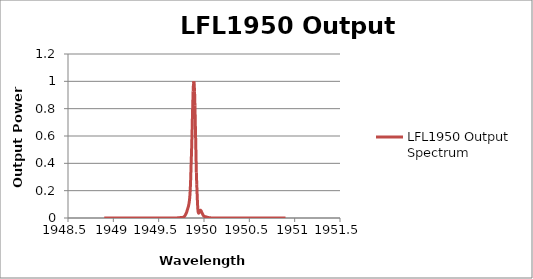
| Category | LFL1950 Output Spectrum |
|---|---|
| 1948.9 | 0 |
| 1948.904 | 0 |
| 1948.908 | 0 |
| 1948.912 | 0 |
| 1948.916 | 0 |
| 1948.92 | 0 |
| 1948.924 | 0 |
| 1948.928 | 0 |
| 1948.932 | 0 |
| 1948.936 | 0 |
| 1948.94 | 0 |
| 1948.944 | 0 |
| 1948.948 | 0 |
| 1948.952 | 0 |
| 1948.956 | 0 |
| 1948.96 | 0 |
| 1948.964 | 0 |
| 1948.968 | 0 |
| 1948.972 | 0 |
| 1948.976 | 0 |
| 1948.98 | 0 |
| 1948.984 | 0 |
| 1948.988 | 0 |
| 1948.992 | 0 |
| 1948.996 | 0 |
| 1949.0 | 0 |
| 1949.004 | 0 |
| 1949.008 | 0 |
| 1949.012 | 0 |
| 1949.016 | 0 |
| 1949.02 | 0 |
| 1949.024 | 0 |
| 1949.028 | 0 |
| 1949.032 | 0 |
| 1949.036 | 0 |
| 1949.04 | 0 |
| 1949.044 | 0 |
| 1949.048 | 0 |
| 1949.052 | 0 |
| 1949.056 | 0 |
| 1949.06 | 0 |
| 1949.064 | 0 |
| 1949.068 | 0 |
| 1949.072 | 0 |
| 1949.076 | 0 |
| 1949.08 | 0 |
| 1949.084 | 0 |
| 1949.088 | 0 |
| 1949.092 | 0 |
| 1949.096 | 0 |
| 1949.1 | 0 |
| 1949.104 | 0 |
| 1949.108 | 0 |
| 1949.112 | 0 |
| 1949.116 | 0 |
| 1949.12 | 0 |
| 1949.124 | 0 |
| 1949.128 | 0 |
| 1949.132 | 0 |
| 1949.136 | 0 |
| 1949.14 | 0 |
| 1949.144 | 0 |
| 1949.148 | 0 |
| 1949.152 | 0 |
| 1949.156 | 0 |
| 1949.16 | 0 |
| 1949.164 | 0 |
| 1949.168 | 0 |
| 1949.172 | 0 |
| 1949.176 | 0 |
| 1949.18 | 0 |
| 1949.184 | 0 |
| 1949.188 | 0 |
| 1949.192 | 0 |
| 1949.196 | 0 |
| 1949.2 | 0 |
| 1949.204 | 0 |
| 1949.208 | 0 |
| 1949.212 | 0 |
| 1949.216 | 0 |
| 1949.22 | 0 |
| 1949.224 | 0 |
| 1949.228 | 0 |
| 1949.232 | 0 |
| 1949.236 | 0 |
| 1949.24 | 0 |
| 1949.244 | 0 |
| 1949.248 | 0 |
| 1949.252 | 0 |
| 1949.256 | 0 |
| 1949.26 | 0 |
| 1949.264 | 0 |
| 1949.268 | 0 |
| 1949.272 | 0 |
| 1949.276 | 0 |
| 1949.28 | 0 |
| 1949.284 | 0 |
| 1949.288 | 0 |
| 1949.292 | 0 |
| 1949.296 | 0 |
| 1949.3 | 0 |
| 1949.304 | 0 |
| 1949.308 | 0 |
| 1949.312 | 0 |
| 1949.316 | 0 |
| 1949.32 | 0 |
| 1949.324 | 0 |
| 1949.328 | 0 |
| 1949.332 | 0 |
| 1949.336 | 0 |
| 1949.34 | 0 |
| 1949.344 | 0 |
| 1949.348 | 0 |
| 1949.352 | 0 |
| 1949.356 | 0 |
| 1949.36 | 0 |
| 1949.364 | 0 |
| 1949.368 | 0 |
| 1949.372 | 0 |
| 1949.376 | 0 |
| 1949.38 | 0 |
| 1949.384 | 0 |
| 1949.388 | 0 |
| 1949.392 | 0 |
| 1949.396 | 0 |
| 1949.4 | 0 |
| 1949.404 | 0 |
| 1949.408 | 0 |
| 1949.412 | 0 |
| 1949.416 | 0 |
| 1949.42 | 0 |
| 1949.424 | 0 |
| 1949.428 | 0 |
| 1949.432 | 0 |
| 1949.436 | 0 |
| 1949.44 | 0 |
| 1949.444 | 0 |
| 1949.448 | 0 |
| 1949.452 | 0 |
| 1949.456 | 0 |
| 1949.46 | 0 |
| 1949.464 | 0 |
| 1949.468 | 0 |
| 1949.472 | 0 |
| 1949.476 | 0 |
| 1949.48 | 0 |
| 1949.484 | 0 |
| 1949.488 | 0 |
| 1949.492 | 0 |
| 1949.496 | 0 |
| 1949.5 | 0 |
| 1949.504 | 0 |
| 1949.508 | 0 |
| 1949.512 | 0 |
| 1949.516 | 0 |
| 1949.52 | 0 |
| 1949.524 | 0 |
| 1949.528 | 0 |
| 1949.532 | 0 |
| 1949.536 | 0 |
| 1949.54 | 0 |
| 1949.544 | 0 |
| 1949.548 | 0 |
| 1949.552 | 0 |
| 1949.556 | 0 |
| 1949.56 | 0 |
| 1949.564 | 0 |
| 1949.568 | 0 |
| 1949.572 | 0 |
| 1949.576 | 0 |
| 1949.58 | 0 |
| 1949.584 | 0 |
| 1949.588 | 0 |
| 1949.592 | 0 |
| 1949.596 | 0 |
| 1949.6 | 0 |
| 1949.604 | 0 |
| 1949.608 | 0 |
| 1949.612 | 0 |
| 1949.616 | 0 |
| 1949.62 | 0 |
| 1949.624 | 0 |
| 1949.628 | 0 |
| 1949.632 | 0 |
| 1949.636 | 0 |
| 1949.64 | 0 |
| 1949.644 | 0 |
| 1949.648 | 0 |
| 1949.652 | 0 |
| 1949.656 | 0 |
| 1949.66 | 0 |
| 1949.664 | 0 |
| 1949.668 | 0 |
| 1949.672 | 0 |
| 1949.676 | 0 |
| 1949.68 | 0 |
| 1949.684 | 0.001 |
| 1949.688 | 0.001 |
| 1949.692 | 0.001 |
| 1949.696 | 0.001 |
| 1949.7 | 0.001 |
| 1949.704 | 0.001 |
| 1949.708 | 0.001 |
| 1949.712 | 0.001 |
| 1949.716 | 0.001 |
| 1949.72 | 0.001 |
| 1949.724 | 0.002 |
| 1949.728 | 0.002 |
| 1949.732 | 0.003 |
| 1949.736 | 0.003 |
| 1949.74 | 0.003 |
| 1949.744 | 0.003 |
| 1949.748 | 0.003 |
| 1949.752 | 0.003 |
| 1949.756 | 0.003 |
| 1949.76 | 0.003 |
| 1949.764 | 0.004 |
| 1949.768 | 0.005 |
| 1949.772 | 0.006 |
| 1949.776 | 0.008 |
| 1949.78 | 0.01 |
| 1949.784 | 0.013 |
| 1949.788 | 0.016 |
| 1949.792 | 0.019 |
| 1949.796 | 0.024 |
| 1949.8 | 0.03 |
| 1949.804 | 0.035 |
| 1949.808 | 0.041 |
| 1949.812 | 0.05 |
| 1949.816 | 0.059 |
| 1949.82 | 0.067 |
| 1949.824 | 0.076 |
| 1949.828 | 0.085 |
| 1949.832 | 0.097 |
| 1949.836 | 0.112 |
| 1949.84 | 0.132 |
| 1949.844 | 0.161 |
| 1949.848 | 0.202 |
| 1949.852 | 0.265 |
| 1949.856 | 0.35 |
| 1949.86 | 0.433 |
| 1949.864 | 0.518 |
| 1949.868 | 0.618 |
| 1949.872 | 0.73 |
| 1949.876 | 0.834 |
| 1949.88 | 0.925 |
| 1949.884 | 0.983 |
| 1949.888 | 1 |
| 1949.892 | 0.98 |
| 1949.896 | 0.923 |
| 1949.9 | 0.825 |
| 1949.904 | 0.701 |
| 1949.908 | 0.576 |
| 1949.912 | 0.45 |
| 1949.916 | 0.331 |
| 1949.92 | 0.248 |
| 1949.924 | 0.18 |
| 1949.928 | 0.114 |
| 1949.932 | 0.067 |
| 1949.936 | 0.043 |
| 1949.94 | 0.036 |
| 1949.944 | 0.037 |
| 1949.948 | 0.043 |
| 1949.952 | 0.05 |
| 1949.956 | 0.055 |
| 1949.96 | 0.057 |
| 1949.964 | 0.056 |
| 1949.968 | 0.052 |
| 1949.972 | 0.046 |
| 1949.976 | 0.039 |
| 1949.98 | 0.035 |
| 1949.984 | 0.03 |
| 1949.988 | 0.024 |
| 1949.992 | 0.019 |
| 1949.996 | 0.016 |
| 1950.0 | 0.013 |
| 1950.004 | 0.012 |
| 1950.008 | 0.011 |
| 1950.012 | 0.01 |
| 1950.016 | 0.009 |
| 1950.02 | 0.009 |
| 1950.024 | 0.008 |
| 1950.028 | 0.007 |
| 1950.032 | 0.006 |
| 1950.036 | 0.005 |
| 1950.04 | 0.005 |
| 1950.044 | 0.004 |
| 1950.048 | 0.004 |
| 1950.052 | 0.003 |
| 1950.056 | 0.002 |
| 1950.06 | 0.002 |
| 1950.064 | 0.002 |
| 1950.068 | 0.001 |
| 1950.072 | 0.001 |
| 1950.076 | 0.001 |
| 1950.08 | 0.001 |
| 1950.084 | 0.001 |
| 1950.088 | 0.001 |
| 1950.092 | 0 |
| 1950.096 | 0 |
| 1950.1 | 0 |
| 1950.104 | 0 |
| 1950.108 | 0 |
| 1950.112 | 0 |
| 1950.116 | 0 |
| 1950.12 | 0 |
| 1950.124 | 0 |
| 1950.128 | 0 |
| 1950.132 | 0 |
| 1950.136 | 0 |
| 1950.14 | 0 |
| 1950.144 | 0 |
| 1950.148 | 0 |
| 1950.152 | 0 |
| 1950.156 | 0 |
| 1950.16 | 0 |
| 1950.164 | 0 |
| 1950.168 | 0 |
| 1950.172 | 0 |
| 1950.176 | 0 |
| 1950.18 | 0 |
| 1950.184 | 0 |
| 1950.188 | 0 |
| 1950.192 | 0 |
| 1950.196 | 0 |
| 1950.2 | 0 |
| 1950.204 | 0 |
| 1950.208 | 0 |
| 1950.212 | 0 |
| 1950.216 | 0 |
| 1950.22 | 0 |
| 1950.224 | 0 |
| 1950.228 | 0 |
| 1950.232 | 0 |
| 1950.236 | 0 |
| 1950.24 | 0 |
| 1950.244 | 0 |
| 1950.248 | 0 |
| 1950.252 | 0 |
| 1950.256 | 0 |
| 1950.26 | 0 |
| 1950.264 | 0 |
| 1950.268 | 0 |
| 1950.272 | 0 |
| 1950.276 | 0 |
| 1950.28 | 0 |
| 1950.284 | 0 |
| 1950.288 | 0 |
| 1950.292 | 0 |
| 1950.296 | 0 |
| 1950.3 | 0 |
| 1950.304 | 0 |
| 1950.308 | 0 |
| 1950.312 | 0 |
| 1950.316 | 0 |
| 1950.32 | 0 |
| 1950.324 | 0 |
| 1950.328 | 0 |
| 1950.332 | 0 |
| 1950.336 | 0 |
| 1950.34 | 0 |
| 1950.344 | 0 |
| 1950.348 | 0 |
| 1950.352 | 0 |
| 1950.356 | 0 |
| 1950.36 | 0 |
| 1950.364 | 0 |
| 1950.368 | 0 |
| 1950.372 | 0 |
| 1950.376 | 0 |
| 1950.38 | 0 |
| 1950.384 | 0 |
| 1950.388 | 0 |
| 1950.392 | 0 |
| 1950.396 | 0 |
| 1950.4 | 0 |
| 1950.404 | 0 |
| 1950.408 | 0 |
| 1950.412 | 0 |
| 1950.416 | 0 |
| 1950.42 | 0 |
| 1950.424 | 0 |
| 1950.428 | 0 |
| 1950.432 | 0 |
| 1950.436 | 0 |
| 1950.44 | 0 |
| 1950.444 | 0 |
| 1950.448 | 0 |
| 1950.452 | 0 |
| 1950.456 | 0 |
| 1950.46 | 0 |
| 1950.464 | 0 |
| 1950.468 | 0 |
| 1950.472 | 0 |
| 1950.476 | 0 |
| 1950.48 | 0 |
| 1950.484 | 0 |
| 1950.488 | 0 |
| 1950.492 | 0 |
| 1950.496 | 0 |
| 1950.5 | 0 |
| 1950.504 | 0 |
| 1950.508 | 0 |
| 1950.512 | 0 |
| 1950.516 | 0 |
| 1950.52 | 0 |
| 1950.524 | 0 |
| 1950.528 | 0 |
| 1950.532 | 0 |
| 1950.536 | 0 |
| 1950.54 | 0 |
| 1950.544 | 0 |
| 1950.548 | 0 |
| 1950.552 | 0 |
| 1950.556 | 0 |
| 1950.56 | 0 |
| 1950.564 | 0 |
| 1950.568 | 0 |
| 1950.572 | 0 |
| 1950.576 | 0 |
| 1950.58 | 0 |
| 1950.584 | 0 |
| 1950.588 | 0 |
| 1950.592 | 0 |
| 1950.596 | 0 |
| 1950.6 | 0 |
| 1950.604 | 0 |
| 1950.608 | 0 |
| 1950.612 | 0 |
| 1950.616 | 0 |
| 1950.62 | 0 |
| 1950.624 | 0 |
| 1950.628 | 0 |
| 1950.632 | 0 |
| 1950.636 | 0 |
| 1950.64 | 0 |
| 1950.644 | 0 |
| 1950.648 | 0 |
| 1950.652 | 0 |
| 1950.656 | 0 |
| 1950.66 | 0 |
| 1950.664 | 0 |
| 1950.668 | 0 |
| 1950.672 | 0 |
| 1950.676 | 0 |
| 1950.68 | 0 |
| 1950.684 | 0 |
| 1950.688 | 0 |
| 1950.692 | 0 |
| 1950.696 | 0 |
| 1950.7 | 0 |
| 1950.704 | 0 |
| 1950.708 | 0 |
| 1950.712 | 0 |
| 1950.716 | 0 |
| 1950.72 | 0 |
| 1950.724 | 0 |
| 1950.728 | 0 |
| 1950.732 | 0 |
| 1950.736 | 0 |
| 1950.74 | 0 |
| 1950.744 | 0 |
| 1950.748 | 0 |
| 1950.752 | 0 |
| 1950.756 | 0 |
| 1950.76 | 0 |
| 1950.764 | 0 |
| 1950.768 | 0 |
| 1950.772 | 0 |
| 1950.776 | 0 |
| 1950.78 | 0 |
| 1950.784 | 0 |
| 1950.788 | 0 |
| 1950.792 | 0 |
| 1950.796 | 0 |
| 1950.8 | 0 |
| 1950.804 | 0 |
| 1950.808 | 0 |
| 1950.812 | 0 |
| 1950.816 | 0 |
| 1950.82 | 0 |
| 1950.824 | 0 |
| 1950.828 | 0 |
| 1950.832 | 0 |
| 1950.836 | 0 |
| 1950.84 | 0 |
| 1950.844 | 0 |
| 1950.848 | 0 |
| 1950.852 | 0 |
| 1950.856 | 0 |
| 1950.86 | 0 |
| 1950.864 | 0 |
| 1950.868 | 0 |
| 1950.872 | 0 |
| 1950.876 | 0 |
| 1950.88 | 0 |
| 1950.884 | 0 |
| 1950.888 | 0 |
| 1950.892 | 0 |
| 1950.896 | 0 |
| 1950.9 | 0 |